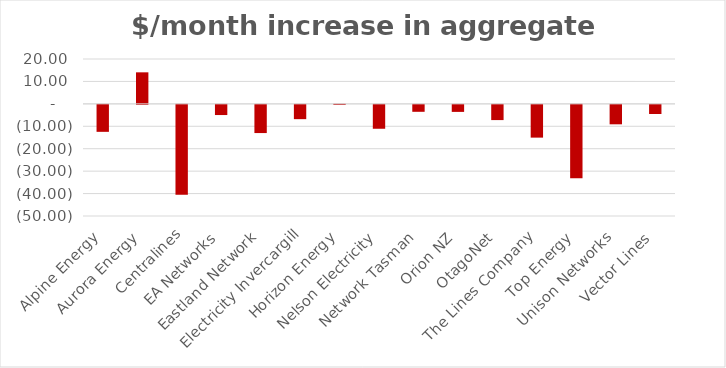
| Category | $/month increase in aggregate prices |
|---|---|
| Alpine Energy | -12.029 |
| Aurora Energy | 14.056 |
| Centralines | -40.073 |
| EA Networks | -4.54 |
| Eastland Network | -12.574 |
| Electricity Invercargill | -6.375 |
| Horizon Energy | 0.063 |
| Nelson Electricity | -10.657 |
| Network Tasman | -3.096 |
| Orion NZ | -3.136 |
| OtagoNet | -6.79 |
| The Lines Company | -14.61 |
| Top Energy | -32.726 |
| Unison Networks | -8.674 |
| Vector Lines | -4.077 |